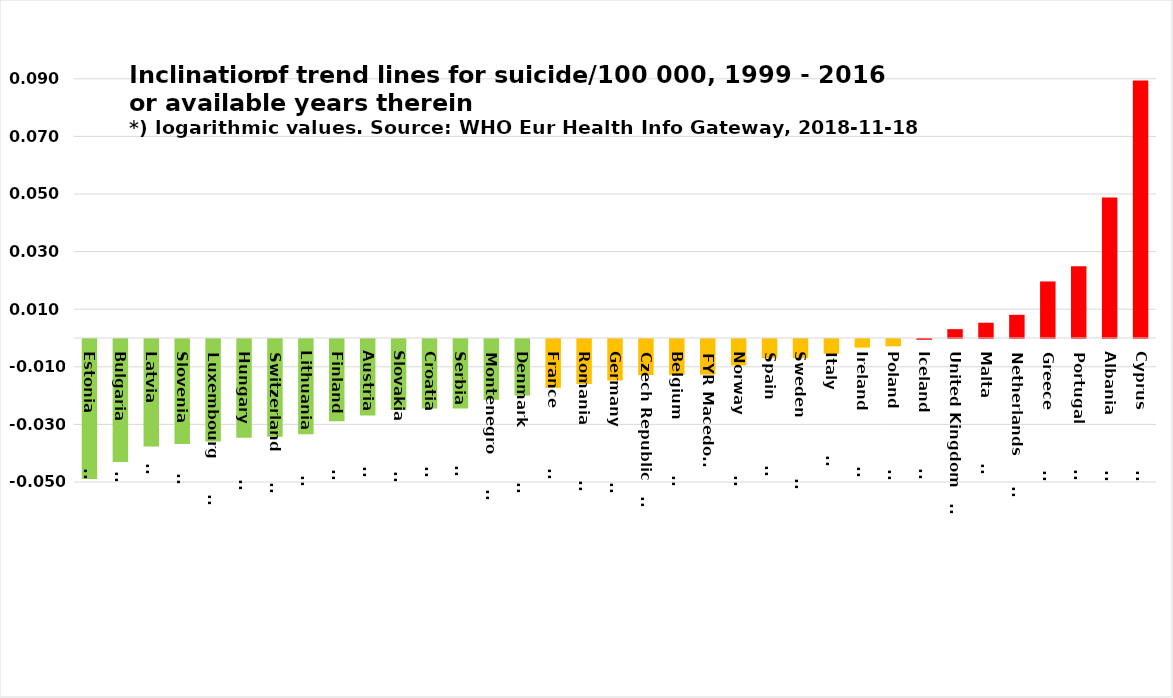
| Category | Series 0 |
|---|---|
| Estonia                | -0.049 |
| Bulgaria               | -0.043 |
| Latvia                 | -0.037 |
| Slovenia               | -0.036 |
| Luxembourg             | -0.036 |
| Hungary                | -0.034 |
| Switzerland            | -0.034 |
| Lithuania              | -0.033 |
| Finland                | -0.029 |
| Austria                | -0.027 |
| Slovakia               | -0.025 |
| Croatia                | -0.024 |
| Serbia                 | -0.024 |
| Montenegro             | -0.021 |
| Denmark                | -0.02 |
| France                 | -0.017 |
| Romania                | -0.016 |
| Germany                | -0.014 |
| Czech Republic         | -0.013 |
| Belgium                | -0.012 |
| FYR Macedonia | -0.012 |
| Norway                 | -0.009 |
| Spain                  | -0.007 |
| Sweden                 | -0.007 |
| Italy                  | -0.005 |
| Ireland                | -0.003 |
| Poland                 | -0.003 |
| Iceland                | 0 |
| United Kingdom         | 0.003 |
| Malta                  | 0.005 |
| Netherlands            | 0.008 |
| Greece                 | 0.02 |
| Portugal               | 0.025 |
| Albania                | 0.049 |
| Cyprus                 | 0.089 |